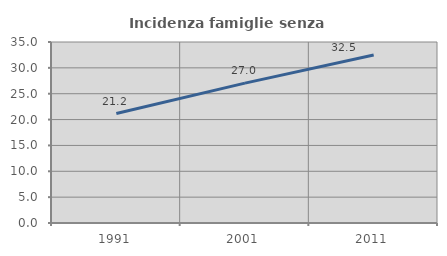
| Category | Incidenza famiglie senza nuclei |
|---|---|
| 1991.0 | 21.174 |
| 2001.0 | 27.045 |
| 2011.0 | 32.493 |